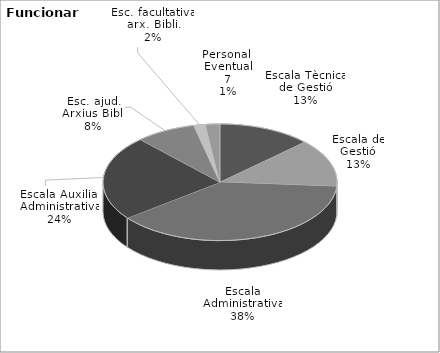
| Category | Series 0 |
|---|---|
| Escala Tècnica de Gestió | 118 |
| Escala de Gestió | 121 |
| Escala Administrativa | 351 |
| Escala Auxiliar Administrativa | 215 |
| Esc. ajud. Arxius Bibl. | 76 |
| Esc. facultativa arx. Bibli. | 15 |
| Personal Eventual | 18 |